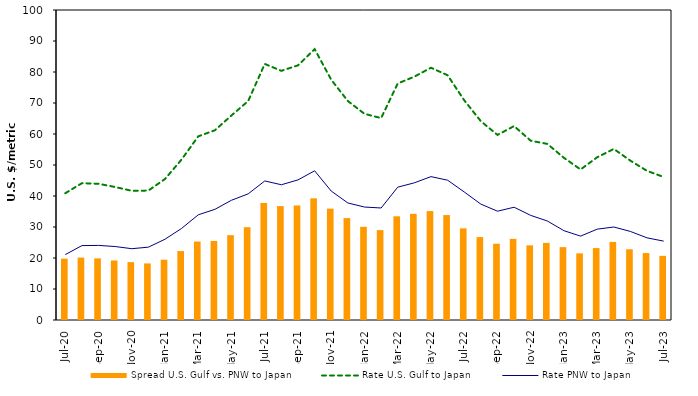
| Category | Spread |
|---|---|
| 2020-07-01 | 19.8 |
| 2020-08-01 | 20.13 |
| 2020-09-01 | 19.88 |
| 2020-10-01 | 19.2 |
| 2020-11-01 | 18.67 |
| 2020-12-01 | 18.25 |
| 2021-01-01 | 19.44 |
| 2021-02-01 | 22.24 |
| 2021-03-01 | 25.31 |
| 2021-04-01 | 25.5 |
| 2021-05-01 | 27.37 |
| 2021-06-01 | 29.94 |
| 2021-07-01 | 37.75 |
| 2021-08-01 | 36.75 |
| 2021-09-01 | 36.95 |
| 2021-10-01 | 39.25 |
| 2021-11-01 | 35.92 |
| 2021-12-01 | 32.88 |
| 2022-01-01 | 30.06 |
| 2022-02-01 | 29 |
| 2022-03-01 | 33.45 |
| 2022-04-01 | 34.25 |
| 2022-05-01 | 35.13 |
| 2022-06-01 | 33.85 |
| 2022-07-01 | 29.57 |
| 2022-08-01 | 26.75 |
| 2022-09-01 | 24.6 |
| 2022-10-01 | 26.18 |
| 2022-11-01 | 24.08 |
| 2022-12-01 | 24.87 |
| 2023-01-01 | 23.5 |
| 2023-02-01 | 21.5 |
| 2023-03-01 | 23.2 |
| 2023-04-01 | 25.19 |
| 2023-05-01 | 22.82 |
| 2023-06-01 | 21.6 |
| 2023-07-01 | 20.69 |